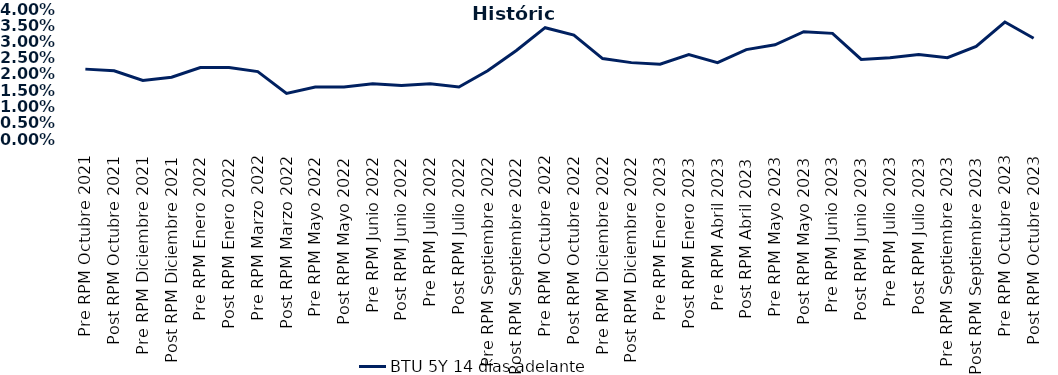
| Category | BTU 5Y 14 días adelante |
|---|---|
| Pre RPM Octubre 2021 | 0.022 |
| Post RPM Octubre 2021 | 0.021 |
| Pre RPM Diciembre 2021 | 0.018 |
| Post RPM Diciembre 2021 | 0.019 |
| Pre RPM Enero 2022 | 0.022 |
| Post RPM Enero 2022 | 0.022 |
| Pre RPM Marzo 2022 | 0.021 |
| Post RPM Marzo 2022 | 0.014 |
| Pre RPM Mayo 2022 | 0.016 |
| Post RPM Mayo 2022 | 0.016 |
| Pre RPM Junio 2022 | 0.017 |
| Post RPM Junio 2022 | 0.016 |
| Pre RPM Julio 2022 | 0.017 |
| Post RPM Julio 2022 | 0.016 |
| Pre RPM Septiembre 2022 | 0.021 |
| Post RPM Septiembre 2022 | 0.027 |
| Pre RPM Octubre 2022 | 0.034 |
| Post RPM Octubre 2022 | 0.032 |
| Pre RPM Diciembre 2022 | 0.025 |
| Post RPM Diciembre 2022 | 0.024 |
| Pre RPM Enero 2023 | 0.023 |
| Post RPM Enero 2023 | 0.026 |
| Pre RPM Abril 2023 | 0.024 |
| Post RPM Abril 2023 | 0.028 |
| Pre RPM Mayo 2023 | 0.029 |
| Post RPM Mayo 2023 | 0.033 |
| Pre RPM Junio 2023 | 0.032 |
| Post RPM Junio 2023 | 0.024 |
| Pre RPM Julio 2023 | 0.025 |
| Post RPM Julio 2023 | 0.026 |
| Pre RPM Septiembre 2023 | 0.025 |
| Post RPM Septiembre 2023 | 0.028 |
| Pre RPM Octubre 2023 | 0.036 |
| Post RPM Octubre 2023 | 0.031 |